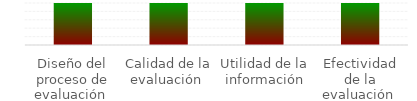
| Category | Niveles |
|---|---|
| Diseño del proceso de evaluación  | 100 |
| Calidad de la evaluación  | 100 |
| Utilidad de la información | 100 |
| Efectividad de la evaluación  | 100 |